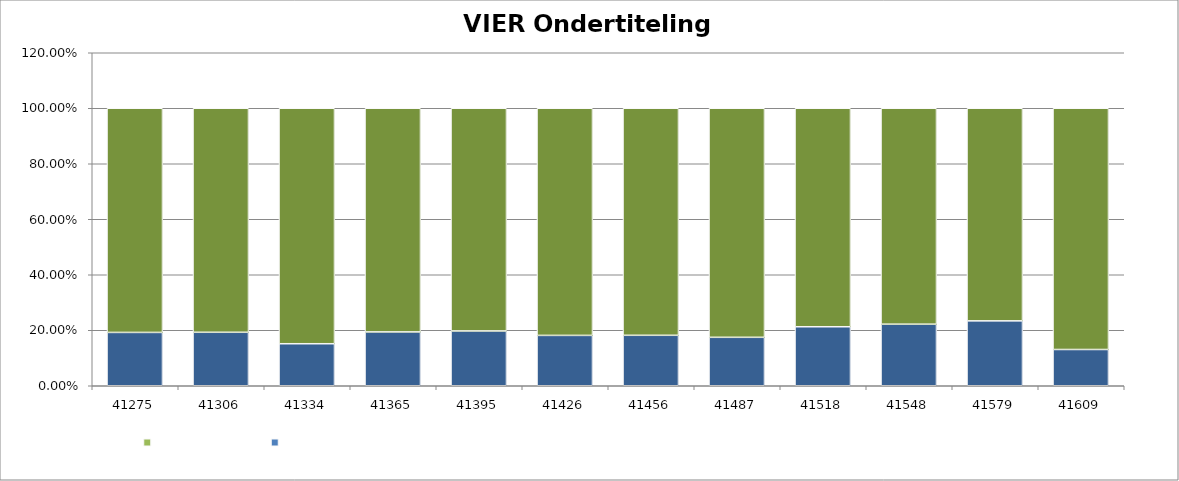
| Category | Series 0 | % programma's niet/onvolledig ondertiteld | % programma's volledig ondertiteld |
|---|---|---|---|
| 41275.0 |  |  | 0.808 |
| 41306.0 |  |  | 0.807 |
| 41334.0 |  |  | 0.849 |
| 41365.0 |  |  | 0.806 |
| 41395.0 |  |  | 0.803 |
| 41426.0 |  |  | 0.818 |
| 41456.0 |  |  | 0.818 |
| 41487.0 |  |  | 0.825 |
| 41518.0 |  |  | 0.787 |
| 41548.0 |  |  | 0.778 |
| 41579.0 |  |  | 0.766 |
| 41609.0 |  |  | 0.869 |